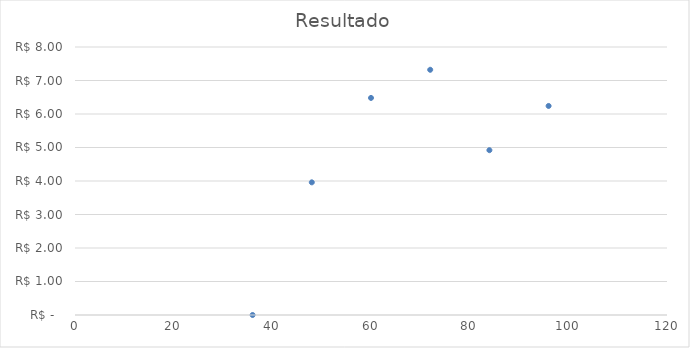
| Category | Series 0 |
|---|---|
| 36.0 | 0 |
| 48.0 | 3.96 |
| 60.0 | 6.48 |
| 72.0 | 7.32 |
| 84.0 | 4.92 |
| 96.0 | 6.24 |